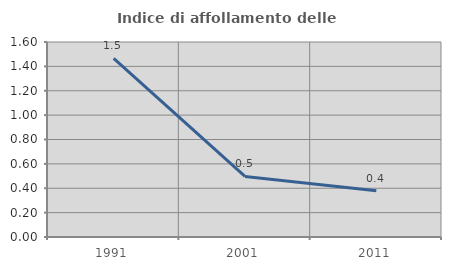
| Category | Indice di affollamento delle abitazioni  |
|---|---|
| 1991.0 | 1.465 |
| 2001.0 | 0.497 |
| 2011.0 | 0.38 |